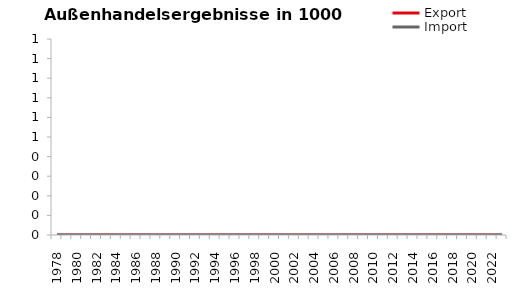
| Category | Export | Import |
|---|---|---|
| 1978.0 | 3725197 | 7302232 |
| 1979.0 | 4540913 | 8301883 |
| 1980.0 | 5069619 | 9367407 |
| 1981.0 | 5328028 | 9447237 |
| 1982.0 | 5687949 | 9806677 |
| 1983.0 | 6202415 | 10508051 |
| 1984.0 | 6769230 | 11375844 |
| 1985.0 | 7748290 | 12818358 |
| 1986.0 | 8149725 | 13042004 |
| 1987.0 | 8667774 | 13222888 |
| 1988.0 | 9755282 | 14603078 |
| 1989.0 | 10768157 | 16316473 |
| 1990.0 | 12429707 | 17664424 |
| 1991.0 | 13589659 | 18505701 |
| 1992.0 | 14108379 | 18505011 |
| 1993.0 | 13244669 | 17019443 |
| 1994.0 | 14193565 | 18295530 |
| 1995.0 | 16167819.887 | 21162496.851 |
| 1996.0 | 16645118.116 | 22205880.183 |
| 1997.0 | 18230312.333 | 23932815.851 |
| 1998.0 | 20243073.984 | 25572237.006 |
| 1999.0 | 21054807.054 | 27379802.945 |
| 2000.0 | 23244003.57 | 30533996.706 |
| 2001.0 | 24160020.312 | 31901114.751 |
| 2002.0 | 24779810.65 | 31085527.177 |
| 2003.0 | 25090500.369 | 33189967.06 |
| 2004.0 | 28951269.316 | 39130293.618 |
| 2005.0 | 30108216.61 | 40732762.078 |
| 2006.0 | 31475202.076 | 43263947.011 |
| 2007.0 | 34446478.249 | 47498026.629 |
| 2008.0 | 35009741.514 | 48490087.452 |
| 2009.0 | 29179081.971 | 39827237.609 |
| 2010.0 | 34529550.238 | 44851304.177 |
| 2011.0 | 38041817.903 | 50050447.826 |
| 2012.0 | 37843019.42 | 49587145.48 |
| 2013.0 | 37873472.507 | 49020287.584 |
| 2014.0 | 38082065.568 | 48543290.417 |
| 2015.0 | 39476866.331 | 49243680.358 |
| 2016.0 | 40054745.164 | 50413887.117 |
| 2017.0 | 42864301.982 | 54399256.851 |
| 2018.0 | 45235259.479 | 55850258.066 |
| 2019.0 | 45032957.679 | 55225810.638 |
| 2020.0 | 43430562.069 | 50514657.633 |
| 2021.0 | 49925358.895 | 59150269.815 |
| 2022.0 | 58012459.368 | 69021883.199 |
| 2023.0 | 58504110.906 | 63848099.957 |